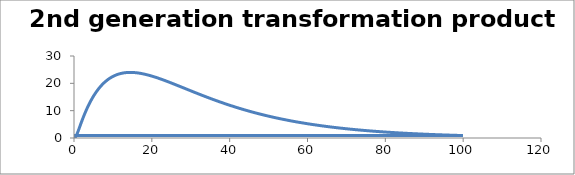
| Category | C - Sys 3 |
|---|---|
| 0.1 | 0 |
| 0.2 | 0.046 |
| 0.3 | 0.173 |
| 0.4 | 0.364 |
| 0.5 | 0.606 |
| 0.6 | 0.888 |
| 0.7000000000000001 | 1.201 |
| 0.8 | 1.538 |
| 0.9000000000000001 | 1.893 |
| 1.0 | 2.262 |
| 1.0999999999999999 | 2.642 |
| 1.2 | 3.028 |
| 1.3 | 3.418 |
| 1.4000000000000001 | 3.81 |
| 1.5 | 4.204 |
| 1.6 | 4.596 |
| 1.7000000000000002 | 4.987 |
| 1.8000000000000003 | 5.376 |
| 1.9 | 5.761 |
| 2.0 | 6.143 |
| 2.1 | 6.521 |
| 2.1999999999999997 | 6.894 |
| 2.3 | 7.262 |
| 2.4 | 7.626 |
| 2.5 | 7.984 |
| 2.6 | 8.337 |
| 2.7 | 8.686 |
| 2.8000000000000003 | 9.028 |
| 2.9000000000000004 | 9.366 |
| 3.0 | 9.698 |
| 3.1 | 10.025 |
| 3.2 | 10.347 |
| 3.3000000000000003 | 10.664 |
| 3.4000000000000004 | 10.975 |
| 3.5000000000000004 | 11.281 |
| 3.6000000000000005 | 11.582 |
| 3.6999999999999997 | 11.878 |
| 3.8 | 12.169 |
| 3.9 | 12.455 |
| 4.0 | 12.736 |
| 4.1000000000000005 | 13.012 |
| 4.2 | 13.284 |
| 4.300000000000001 | 13.55 |
| 4.3999999999999995 | 13.812 |
| 4.5 | 14.069 |
| 4.6 | 14.322 |
| 4.7 | 14.57 |
| 4.8 | 14.814 |
| 4.9 | 15.053 |
| 5.0 | 15.288 |
| 5.1000000000000005 | 15.518 |
| 5.2 | 15.744 |
| 5.3 | 15.966 |
| 5.4 | 16.184 |
| 5.5 | 16.398 |
| 5.6000000000000005 | 16.608 |
| 5.7 | 16.814 |
| 5.800000000000001 | 17.015 |
| 5.9 | 17.213 |
| 6.0 | 17.407 |
| 6.1 | 17.597 |
| 6.2 | 17.784 |
| 6.3 | 17.967 |
| 6.4 | 18.146 |
| 6.5 | 18.321 |
| 6.6000000000000005 | 18.493 |
| 6.7 | 18.662 |
| 6.800000000000001 | 18.827 |
| 6.9 | 18.988 |
| 7.000000000000001 | 19.146 |
| 7.1000000000000005 | 19.301 |
| 7.200000000000001 | 19.453 |
| 7.3 | 19.601 |
| 7.3999999999999995 | 19.746 |
| 7.5 | 19.888 |
| 7.6 | 20.027 |
| 7.7 | 20.162 |
| 7.8 | 20.295 |
| 7.9 | 20.425 |
| 8.0 | 20.551 |
| 8.1 | 20.675 |
| 8.200000000000001 | 20.796 |
| 8.3 | 20.914 |
| 8.4 | 21.029 |
| 8.5 | 21.142 |
| 8.600000000000001 | 21.251 |
| 8.700000000000001 | 21.358 |
| 8.799999999999999 | 21.463 |
| 8.9 | 21.565 |
| 9.0 | 21.664 |
| 9.1 | 21.76 |
| 9.2 | 21.854 |
| 9.3 | 21.946 |
| 9.4 | 22.035 |
| 9.5 | 22.122 |
| 9.6 | 22.206 |
| 9.700000000000001 | 22.288 |
| 9.8 | 22.367 |
| 9.9 | 22.445 |
| 10.0 | 22.52 |
| 10.100000000000001 | 22.593 |
| 10.200000000000001 | 22.663 |
| 10.3 | 22.732 |
| 10.4 | 22.798 |
| 10.5 | 22.862 |
| 10.6 | 22.924 |
| 10.7 | 22.984 |
| 10.8 | 23.042 |
| 10.9 | 23.098 |
| 11.0 | 23.152 |
| 11.1 | 23.205 |
| 11.200000000000001 | 23.255 |
| 11.3 | 23.303 |
| 11.4 | 23.349 |
| 11.5 | 23.394 |
| 11.600000000000001 | 23.437 |
| 11.700000000000001 | 23.478 |
| 11.8 | 23.517 |
| 11.9 | 23.555 |
| 12.0 | 23.591 |
| 12.1 | 23.625 |
| 12.2 | 23.657 |
| 12.3 | 23.688 |
| 12.4 | 23.717 |
| 12.5 | 23.745 |
| 12.6 | 23.771 |
| 12.7 | 23.795 |
| 12.8 | 23.818 |
| 12.9 | 23.84 |
| 13.0 | 23.86 |
| 13.100000000000001 | 23.879 |
| 13.200000000000001 | 23.896 |
| 13.3 | 23.911 |
| 13.4 | 23.926 |
| 13.5 | 23.939 |
| 13.600000000000001 | 23.95 |
| 13.700000000000001 | 23.961 |
| 13.8 | 23.969 |
| 13.900000000000002 | 23.977 |
| 14.000000000000002 | 23.983 |
| 14.100000000000001 | 23.989 |
| 14.200000000000001 | 23.993 |
| 14.3 | 23.995 |
| 14.400000000000002 | 23.997 |
| 14.499999999999998 | 23.997 |
| 14.6 | 23.996 |
| 14.7 | 23.994 |
| 14.799999999999999 | 23.991 |
| 14.899999999999999 | 23.987 |
| 15.0 | 23.981 |
| 15.1 | 23.975 |
| 15.2 | 23.967 |
| 15.299999999999999 | 23.959 |
| 15.4 | 23.949 |
| 15.5 | 23.939 |
| 15.6 | 23.927 |
| 15.7 | 23.915 |
| 15.8 | 23.901 |
| 15.9 | 23.887 |
| 16.0 | 23.871 |
| 16.1 | 23.855 |
| 16.2 | 23.838 |
| 16.3 | 23.82 |
| 16.400000000000002 | 23.801 |
| 16.5 | 23.781 |
| 16.6 | 23.76 |
| 16.7 | 23.739 |
| 16.8 | 23.717 |
| 16.900000000000002 | 23.694 |
| 17.0 | 23.67 |
| 17.1 | 23.645 |
| 17.200000000000003 | 23.62 |
| 17.3 | 23.593 |
| 17.400000000000002 | 23.566 |
| 17.5 | 23.539 |
| 17.599999999999998 | 23.51 |
| 17.7 | 23.481 |
| 17.8 | 23.451 |
| 17.9 | 23.421 |
| 18.0 | 23.39 |
| 18.099999999999998 | 23.358 |
| 18.2 | 23.326 |
| 18.3 | 23.293 |
| 18.4 | 23.259 |
| 18.5 | 23.225 |
| 18.6 | 23.19 |
| 18.7 | 23.154 |
| 18.8 | 23.118 |
| 18.9 | 23.082 |
| 19.0 | 23.045 |
| 19.1 | 23.007 |
| 19.2 | 22.969 |
| 19.3 | 22.93 |
| 19.400000000000002 | 22.891 |
| 19.5 | 22.851 |
| 19.6 | 22.811 |
| 19.7 | 22.77 |
| 19.8 | 22.729 |
| 19.900000000000002 | 22.687 |
| 20.0 | 22.645 |
| 20.1 | 22.602 |
| 20.200000000000003 | 22.559 |
| 20.3 | 22.516 |
| 20.400000000000002 | 22.472 |
| 20.5 | 22.427 |
| 20.6 | 22.383 |
| 20.700000000000003 | 22.338 |
| 20.8 | 22.292 |
| 20.9 | 22.246 |
| 21.0 | 22.2 |
| 21.099999999999998 | 22.153 |
| 21.2 | 22.106 |
| 21.3 | 22.059 |
| 21.4 | 22.011 |
| 21.5 | 21.963 |
| 21.6 | 21.915 |
| 21.7 | 21.866 |
| 21.8 | 21.817 |
| 21.9 | 21.768 |
| 22.0 | 21.718 |
| 22.1 | 21.668 |
| 22.2 | 21.618 |
| 22.3 | 21.568 |
| 22.400000000000002 | 21.517 |
| 22.5 | 21.466 |
| 22.6 | 21.415 |
| 22.7 | 21.363 |
| 22.8 | 21.312 |
| 22.900000000000002 | 21.26 |
| 23.0 | 21.208 |
| 23.1 | 21.155 |
| 23.200000000000003 | 21.103 |
| 23.3 | 21.05 |
| 23.400000000000002 | 20.997 |
| 23.5 | 20.943 |
| 23.6 | 20.89 |
| 23.700000000000003 | 20.836 |
| 23.8 | 20.782 |
| 23.900000000000002 | 20.728 |
| 24.0 | 20.674 |
| 24.099999999999998 | 20.62 |
| 24.2 | 20.565 |
| 24.3 | 20.51 |
| 24.4 | 20.456 |
| 24.5 | 20.401 |
| 24.6 | 20.345 |
| 24.7 | 20.29 |
| 24.8 | 20.235 |
| 24.9 | 20.179 |
| 25.0 | 20.123 |
| 25.1 | 20.068 |
| 25.2 | 20.012 |
| 25.3 | 19.956 |
| 25.4 | 19.899 |
| 25.5 | 19.843 |
| 25.6 | 19.787 |
| 25.7 | 19.73 |
| 25.8 | 19.674 |
| 25.900000000000002 | 19.617 |
| 26.0 | 19.561 |
| 26.1 | 19.504 |
| 26.200000000000003 | 19.447 |
| 26.3 | 19.39 |
| 26.400000000000002 | 19.333 |
| 26.5 | 19.276 |
| 26.6 | 19.219 |
| 26.700000000000003 | 19.162 |
| 26.8 | 19.104 |
| 26.900000000000002 | 19.047 |
| 27.0 | 18.99 |
| 27.1 | 18.932 |
| 27.200000000000003 | 18.875 |
| 27.3 | 18.818 |
| 27.400000000000002 | 18.76 |
| 27.500000000000004 | 18.703 |
| 27.6 | 18.645 |
| 27.700000000000003 | 18.587 |
| 27.800000000000004 | 18.53 |
| 27.900000000000002 | 18.472 |
| 28.000000000000004 | 18.415 |
| 28.1 | 18.357 |
| 28.200000000000003 | 18.299 |
| 28.300000000000004 | 18.242 |
| 28.400000000000002 | 18.184 |
| 28.500000000000004 | 18.127 |
| 28.6 | 18.069 |
| 28.700000000000003 | 18.011 |
| 28.800000000000004 | 17.954 |
| 28.9 | 17.896 |
| 28.999999999999996 | 17.839 |
| 29.099999999999998 | 17.781 |
| 29.2 | 17.724 |
| 29.299999999999997 | 17.666 |
| 29.4 | 17.609 |
| 29.5 | 17.551 |
| 29.599999999999998 | 17.494 |
| 29.7 | 17.436 |
| 29.799999999999997 | 17.379 |
| 29.9 | 17.322 |
| 30.0 | 17.264 |
| 30.099999999999998 | 17.207 |
| 30.2 | 17.15 |
| 30.3 | 17.093 |
| 30.4 | 17.036 |
| 30.5 | 16.979 |
| 30.599999999999998 | 16.922 |
| 30.7 | 16.865 |
| 30.8 | 16.808 |
| 30.9 | 16.751 |
| 31.0 | 16.694 |
| 31.1 | 16.637 |
| 31.2 | 16.581 |
| 31.3 | 16.524 |
| 31.4 | 16.468 |
| 31.5 | 16.411 |
| 31.6 | 16.355 |
| 31.7 | 16.298 |
| 31.8 | 16.242 |
| 31.900000000000002 | 16.186 |
| 32.0 | 16.13 |
| 32.1 | 16.074 |
| 32.2 | 16.018 |
| 32.300000000000004 | 15.962 |
| 32.4 | 15.906 |
| 32.5 | 15.851 |
| 32.6 | 15.795 |
| 32.7 | 15.739 |
| 32.800000000000004 | 15.684 |
| 32.9 | 15.629 |
| 33.0 | 15.573 |
| 33.1 | 15.518 |
| 33.2 | 15.463 |
| 33.300000000000004 | 15.408 |
| 33.4 | 15.353 |
| 33.5 | 15.298 |
| 33.6 | 15.244 |
| 33.7 | 15.189 |
| 33.800000000000004 | 15.135 |
| 33.900000000000006 | 15.08 |
| 34.0 | 15.026 |
| 34.1 | 14.972 |
| 34.2 | 14.918 |
| 34.300000000000004 | 14.864 |
| 34.400000000000006 | 14.81 |
| 34.5 | 14.756 |
| 34.6 | 14.702 |
| 34.7 | 14.649 |
| 34.800000000000004 | 14.595 |
| 34.900000000000006 | 14.542 |
| 35.0 | 14.489 |
| 35.1 | 14.436 |
| 35.199999999999996 | 14.383 |
| 35.3 | 14.33 |
| 35.4 | 14.277 |
| 35.5 | 14.225 |
| 35.6 | 14.172 |
| 35.699999999999996 | 14.12 |
| 35.8 | 14.067 |
| 35.9 | 14.015 |
| 36.0 | 13.963 |
| 36.1 | 13.911 |
| 36.199999999999996 | 13.859 |
| 36.3 | 13.808 |
| 36.4 | 13.756 |
| 36.5 | 13.705 |
| 36.6 | 13.653 |
| 36.7 | 13.602 |
| 36.8 | 13.551 |
| 36.9 | 13.5 |
| 37.0 | 13.449 |
| 37.1 | 13.399 |
| 37.2 | 13.348 |
| 37.3 | 13.298 |
| 37.4 | 13.247 |
| 37.5 | 13.197 |
| 37.6 | 13.147 |
| 37.7 | 13.097 |
| 37.8 | 13.047 |
| 37.9 | 12.998 |
| 38.0 | 12.948 |
| 38.1 | 12.899 |
| 38.2 | 12.85 |
| 38.3 | 12.8 |
| 38.4 | 12.751 |
| 38.5 | 12.702 |
| 38.6 | 12.654 |
| 38.7 | 12.605 |
| 38.800000000000004 | 12.557 |
| 38.9 | 12.508 |
| 39.0 | 12.46 |
| 39.1 | 12.412 |
| 39.2 | 12.364 |
| 39.300000000000004 | 12.316 |
| 39.4 | 12.269 |
| 39.5 | 12.221 |
| 39.6 | 12.174 |
| 39.7 | 12.126 |
| 39.800000000000004 | 12.079 |
| 39.900000000000006 | 12.032 |
| 40.0 | 11.985 |
| 40.1 | 11.939 |
| 40.2 | 11.892 |
| 40.300000000000004 | 11.846 |
| 40.400000000000006 | 11.799 |
| 40.5 | 11.753 |
| 40.6 | 11.707 |
| 40.7 | 11.661 |
| 40.800000000000004 | 11.616 |
| 40.900000000000006 | 11.57 |
| 41.0 | 11.524 |
| 41.1 | 11.479 |
| 41.2 | 11.434 |
| 41.300000000000004 | 11.389 |
| 41.400000000000006 | 11.344 |
| 41.5 | 11.299 |
| 41.6 | 11.254 |
| 41.699999999999996 | 11.21 |
| 41.8 | 11.165 |
| 41.9 | 11.121 |
| 42.0 | 11.077 |
| 42.1 | 11.033 |
| 42.199999999999996 | 10.989 |
| 42.3 | 10.946 |
| 42.4 | 10.902 |
| 42.5 | 10.859 |
| 42.6 | 10.815 |
| 42.699999999999996 | 10.772 |
| 42.8 | 10.729 |
| 42.9 | 10.686 |
| 43.0 | 10.644 |
| 43.1 | 10.601 |
| 43.2 | 10.559 |
| 43.3 | 10.516 |
| 43.4 | 10.474 |
| 43.5 | 10.432 |
| 43.6 | 10.39 |
| 43.7 | 10.349 |
| 43.8 | 10.307 |
| 43.9 | 10.265 |
| 44.0 | 10.224 |
| 44.1 | 10.183 |
| 44.2 | 10.142 |
| 44.3 | 10.101 |
| 44.4 | 10.06 |
| 44.5 | 10.019 |
| 44.6 | 9.979 |
| 44.7 | 9.939 |
| 44.800000000000004 | 9.898 |
| 44.9 | 9.858 |
| 45.0 | 9.818 |
| 45.1 | 9.778 |
| 45.2 | 9.739 |
| 45.300000000000004 | 9.699 |
| 45.4 | 9.66 |
| 45.5 | 9.62 |
| 45.6 | 9.581 |
| 45.7 | 9.542 |
| 45.800000000000004 | 9.503 |
| 45.9 | 9.465 |
| 46.0 | 9.426 |
| 46.1 | 9.387 |
| 46.2 | 9.349 |
| 46.300000000000004 | 9.311 |
| 46.400000000000006 | 9.273 |
| 46.5 | 9.235 |
| 46.6 | 9.197 |
| 46.7 | 9.159 |
| 46.800000000000004 | 9.122 |
| 46.900000000000006 | 9.084 |
| 47.0 | 9.047 |
| 47.1 | 9.01 |
| 47.2 | 8.973 |
| 47.300000000000004 | 8.936 |
| 47.400000000000006 | 8.899 |
| 47.5 | 8.863 |
| 47.6 | 8.826 |
| 47.7 | 8.79 |
| 47.800000000000004 | 8.754 |
| 47.900000000000006 | 8.717 |
| 48.0 | 8.681 |
| 48.1 | 8.646 |
| 48.199999999999996 | 8.61 |
| 48.3 | 8.574 |
| 48.4 | 8.539 |
| 48.5 | 8.504 |
| 48.6 | 8.468 |
| 48.699999999999996 | 8.433 |
| 48.8 | 8.398 |
| 48.9 | 8.364 |
| 49.0 | 8.329 |
| 49.1 | 8.294 |
| 49.2 | 8.26 |
| 49.3 | 8.226 |
| 49.4 | 8.191 |
| 49.5 | 8.157 |
| 49.6 | 8.123 |
| 49.7 | 8.09 |
| 49.8 | 8.056 |
| 49.9 | 8.022 |
| 50.0 | 7.989 |
| 50.1 | 7.956 |
| 50.2 | 7.922 |
| 50.3 | 7.889 |
| 50.4 | 7.856 |
| 50.5 | 7.824 |
| 50.6 | 7.791 |
| 50.7 | 7.758 |
| 50.8 | 7.726 |
| 50.9 | 7.694 |
| 51.0 | 7.661 |
| 51.1 | 7.629 |
| 51.2 | 7.597 |
| 51.300000000000004 | 7.566 |
| 51.4 | 7.534 |
| 51.5 | 7.502 |
| 51.6 | 7.471 |
| 51.7 | 7.44 |
| 51.800000000000004 | 7.408 |
| 51.9 | 7.377 |
| 52.0 | 7.346 |
| 52.1 | 7.315 |
| 52.2 | 7.285 |
| 52.300000000000004 | 7.254 |
| 52.400000000000006 | 7.223 |
| 52.5 | 7.193 |
| 52.6 | 7.163 |
| 52.7 | 7.133 |
| 52.800000000000004 | 7.102 |
| 52.900000000000006 | 7.073 |
| 53.0 | 7.043 |
| 53.1 | 7.013 |
| 53.2 | 6.983 |
| 53.300000000000004 | 6.954 |
| 53.400000000000006 | 6.925 |
| 53.5 | 6.895 |
| 53.6 | 6.866 |
| 53.7 | 6.837 |
| 53.800000000000004 | 6.808 |
| 53.900000000000006 | 6.779 |
| 54.0 | 6.751 |
| 54.1 | 6.722 |
| 54.2 | 6.694 |
| 54.300000000000004 | 6.665 |
| 54.400000000000006 | 6.637 |
| 54.50000000000001 | 6.609 |
| 54.6 | 6.581 |
| 54.7 | 6.553 |
| 54.800000000000004 | 6.525 |
| 54.900000000000006 | 6.498 |
| 55.00000000000001 | 6.47 |
| 55.1 | 6.443 |
| 55.2 | 6.415 |
| 55.300000000000004 | 6.388 |
| 55.400000000000006 | 6.361 |
| 55.50000000000001 | 6.334 |
| 55.60000000000001 | 6.307 |
| 55.7 | 6.28 |
| 55.800000000000004 | 6.253 |
| 55.900000000000006 | 6.227 |
| 56.00000000000001 | 6.2 |
| 56.10000000000001 | 6.174 |
| 56.2 | 6.147 |
| 56.300000000000004 | 6.121 |
| 56.400000000000006 | 6.095 |
| 56.50000000000001 | 6.069 |
| 56.60000000000001 | 6.043 |
| 56.7 | 6.017 |
| 56.800000000000004 | 5.992 |
| 56.900000000000006 | 5.966 |
| 57.00000000000001 | 5.941 |
| 57.10000000000001 | 5.915 |
| 57.2 | 5.89 |
| 57.300000000000004 | 5.865 |
| 57.400000000000006 | 5.84 |
| 57.50000000000001 | 5.815 |
| 57.60000000000001 | 5.79 |
| 57.699999999999996 | 5.765 |
| 57.8 | 5.741 |
| 57.9 | 5.716 |
| 57.99999999999999 | 5.692 |
| 58.099999999999994 | 5.667 |
| 58.199999999999996 | 5.643 |
| 58.3 | 5.619 |
| 58.4 | 5.595 |
| 58.5 | 5.571 |
| 58.599999999999994 | 5.547 |
| 58.699999999999996 | 5.523 |
| 58.8 | 5.499 |
| 58.9 | 5.476 |
| 59.0 | 5.452 |
| 59.099999999999994 | 5.429 |
| 59.199999999999996 | 5.406 |
| 59.3 | 5.382 |
| 59.4 | 5.359 |
| 59.5 | 5.336 |
| 59.599999999999994 | 5.313 |
| 59.699999999999996 | 5.29 |
| 59.8 | 5.268 |
| 59.9 | 5.245 |
| 60.0 | 5.222 |
| 60.099999999999994 | 5.2 |
| 60.199999999999996 | 5.178 |
| 60.3 | 5.155 |
| 60.4 | 5.133 |
| 60.5 | 5.111 |
| 60.6 | 5.089 |
| 60.699999999999996 | 5.067 |
| 60.8 | 5.045 |
| 60.9 | 5.024 |
| 61.0 | 5.002 |
| 61.1 | 4.98 |
| 61.199999999999996 | 4.959 |
| 61.3 | 4.937 |
| 61.4 | 4.916 |
| 61.5 | 4.895 |
| 61.6 | 4.874 |
| 61.7 | 4.853 |
| 61.8 | 4.832 |
| 61.9 | 4.811 |
| 62.0 | 4.79 |
| 62.1 | 4.77 |
| 62.2 | 4.749 |
| 62.3 | 4.728 |
| 62.4 | 4.708 |
| 62.5 | 4.688 |
| 62.6 | 4.667 |
| 62.7 | 4.647 |
| 62.8 | 4.627 |
| 62.9 | 4.607 |
| 63.0 | 4.587 |
| 63.1 | 4.567 |
| 63.2 | 4.548 |
| 63.3 | 4.528 |
| 63.4 | 4.508 |
| 63.5 | 4.489 |
| 63.6 | 4.469 |
| 63.7 | 4.45 |
| 63.800000000000004 | 4.431 |
| 63.9 | 4.412 |
| 64.0 | 4.392 |
| 64.1 | 4.373 |
| 64.2 | 4.354 |
| 64.3 | 4.336 |
| 64.4 | 4.317 |
| 64.5 | 4.298 |
| 64.60000000000001 | 4.279 |
| 64.7 | 4.261 |
| 64.8 | 4.242 |
| 64.9 | 4.224 |
| 65.0 | 4.206 |
| 65.10000000000001 | 4.187 |
| 65.2 | 4.169 |
| 65.3 | 4.151 |
| 65.4 | 4.133 |
| 65.5 | 4.115 |
| 65.60000000000001 | 4.097 |
| 65.7 | 4.079 |
| 65.8 | 4.062 |
| 65.9 | 4.044 |
| 66.0 | 4.026 |
| 66.10000000000001 | 4.009 |
| 66.2 | 3.991 |
| 66.3 | 3.974 |
| 66.4 | 3.957 |
| 66.5 | 3.94 |
| 66.60000000000001 | 3.922 |
| 66.7 | 3.905 |
| 66.8 | 3.888 |
| 66.9 | 3.872 |
| 67.0 | 3.855 |
| 67.10000000000001 | 3.838 |
| 67.2 | 3.821 |
| 67.30000000000001 | 3.805 |
| 67.4 | 3.788 |
| 67.5 | 3.771 |
| 67.60000000000001 | 3.755 |
| 67.7 | 3.739 |
| 67.80000000000001 | 3.722 |
| 67.9 | 3.706 |
| 68.0 | 3.69 |
| 68.10000000000001 | 3.674 |
| 68.2 | 3.658 |
| 68.30000000000001 | 3.642 |
| 68.4 | 3.626 |
| 68.5 | 3.61 |
| 68.60000000000001 | 3.595 |
| 68.7 | 3.579 |
| 68.80000000000001 | 3.563 |
| 68.9 | 3.548 |
| 69.0 | 3.532 |
| 69.10000000000001 | 3.517 |
| 69.2 | 3.501 |
| 69.30000000000001 | 3.486 |
| 69.4 | 3.471 |
| 69.5 | 3.456 |
| 69.60000000000001 | 3.441 |
| 69.7 | 3.426 |
| 69.80000000000001 | 3.411 |
| 69.9 | 3.396 |
| 70.0 | 3.381 |
| 70.10000000000001 | 3.366 |
| 70.2 | 3.352 |
| 70.30000000000001 | 3.337 |
| 70.39999999999999 | 3.322 |
| 70.5 | 3.308 |
| 70.6 | 3.293 |
| 70.7 | 3.279 |
| 70.8 | 3.265 |
| 70.89999999999999 | 3.25 |
| 71.0 | 3.236 |
| 71.1 | 3.222 |
| 71.2 | 3.208 |
| 71.3 | 3.194 |
| 71.39999999999999 | 3.18 |
| 71.5 | 3.166 |
| 71.6 | 3.152 |
| 71.7 | 3.138 |
| 71.8 | 3.125 |
| 71.89999999999999 | 3.111 |
| 72.0 | 3.097 |
| 72.1 | 3.084 |
| 72.2 | 3.07 |
| 72.3 | 3.057 |
| 72.39999999999999 | 3.043 |
| 72.5 | 3.03 |
| 72.6 | 3.017 |
| 72.7 | 3.004 |
| 72.8 | 2.99 |
| 72.89999999999999 | 2.977 |
| 73.0 | 2.964 |
| 73.1 | 2.951 |
| 73.2 | 2.938 |
| 73.3 | 2.925 |
| 73.4 | 2.913 |
| 73.5 | 2.9 |
| 73.6 | 2.887 |
| 73.7 | 2.874 |
| 73.8 | 2.862 |
| 73.9 | 2.849 |
| 74.0 | 2.837 |
| 74.1 | 2.824 |
| 74.2 | 2.812 |
| 74.3 | 2.8 |
| 74.4 | 2.787 |
| 74.5 | 2.775 |
| 74.6 | 2.763 |
| 74.7 | 2.751 |
| 74.8 | 2.739 |
| 74.9 | 2.727 |
| 75.0 | 2.715 |
| 75.1 | 2.703 |
| 75.2 | 2.691 |
| 75.3 | 2.679 |
| 75.4 | 2.667 |
| 75.5 | 2.656 |
| 75.6 | 2.644 |
| 75.7 | 2.632 |
| 75.8 | 2.621 |
| 75.9 | 2.609 |
| 76.0 | 2.598 |
| 76.1 | 2.587 |
| 76.2 | 2.575 |
| 76.3 | 2.564 |
| 76.4 | 2.553 |
| 76.5 | 2.541 |
| 76.6 | 2.53 |
| 76.7 | 2.519 |
| 76.8 | 2.508 |
| 76.9 | 2.497 |
| 77.0 | 2.486 |
| 77.10000000000001 | 2.475 |
| 77.2 | 2.464 |
| 77.3 | 2.453 |
| 77.4 | 2.443 |
| 77.5 | 2.432 |
| 77.60000000000001 | 2.421 |
| 77.7 | 2.411 |
| 77.8 | 2.4 |
| 77.9 | 2.389 |
| 78.0 | 2.379 |
| 78.10000000000001 | 2.368 |
| 78.2 | 2.358 |
| 78.3 | 2.348 |
| 78.4 | 2.337 |
| 78.5 | 2.327 |
| 78.60000000000001 | 2.317 |
| 78.7 | 2.307 |
| 78.8 | 2.296 |
| 78.9 | 2.286 |
| 79.0 | 2.276 |
| 79.10000000000001 | 2.266 |
| 79.2 | 2.256 |
| 79.3 | 2.246 |
| 79.4 | 2.236 |
| 79.5 | 2.227 |
| 79.60000000000001 | 2.217 |
| 79.7 | 2.207 |
| 79.80000000000001 | 2.197 |
| 79.9 | 2.188 |
| 80.0 | 2.178 |
| 80.10000000000001 | 2.168 |
| 80.2 | 2.159 |
| 80.30000000000001 | 2.149 |
| 80.4 | 2.14 |
| 80.5 | 2.131 |
| 80.60000000000001 | 2.121 |
| 80.7 | 2.112 |
| 80.80000000000001 | 2.102 |
| 80.9 | 2.093 |
| 81.0 | 2.084 |
| 81.10000000000001 | 2.075 |
| 81.2 | 2.066 |
| 81.30000000000001 | 2.057 |
| 81.4 | 2.048 |
| 81.5 | 2.039 |
| 81.60000000000001 | 2.03 |
| 81.7 | 2.021 |
| 81.80000000000001 | 2.012 |
| 81.9 | 2.003 |
| 82.0 | 1.994 |
| 82.10000000000001 | 1.985 |
| 82.2 | 1.976 |
| 82.30000000000001 | 1.968 |
| 82.4 | 1.959 |
| 82.5 | 1.95 |
| 82.60000000000001 | 1.942 |
| 82.7 | 1.933 |
| 82.80000000000001 | 1.925 |
| 82.9 | 1.916 |
| 83.0 | 1.908 |
| 83.10000000000001 | 1.899 |
| 83.2 | 1.891 |
| 83.3 | 1.883 |
| 83.39999999999999 | 1.874 |
| 83.5 | 1.866 |
| 83.6 | 1.858 |
| 83.7 | 1.85 |
| 83.8 | 1.842 |
| 83.89999999999999 | 1.833 |
| 84.0 | 1.825 |
| 84.1 | 1.817 |
| 84.2 | 1.809 |
| 84.3 | 1.801 |
| 84.39999999999999 | 1.793 |
| 84.5 | 1.785 |
| 84.6 | 1.778 |
| 84.7 | 1.77 |
| 84.8 | 1.762 |
| 84.89999999999999 | 1.754 |
| 85.0 | 1.746 |
| 85.1 | 1.739 |
| 85.2 | 1.731 |
| 85.3 | 1.723 |
| 85.39999999999999 | 1.716 |
| 85.5 | 1.708 |
| 85.6 | 1.701 |
| 85.7 | 1.693 |
| 85.8 | 1.686 |
| 85.9 | 1.678 |
| 86.0 | 1.671 |
| 86.1 | 1.663 |
| 86.2 | 1.656 |
| 86.3 | 1.649 |
| 86.4 | 1.641 |
| 86.5 | 1.634 |
| 86.6 | 1.627 |
| 86.7 | 1.62 |
| 86.8 | 1.613 |
| 86.9 | 1.606 |
| 87.0 | 1.598 |
| 87.1 | 1.591 |
| 87.2 | 1.584 |
| 87.3 | 1.577 |
| 87.4 | 1.57 |
| 87.5 | 1.563 |
| 87.6 | 1.557 |
| 87.7 | 1.55 |
| 87.8 | 1.543 |
| 87.9 | 1.536 |
| 88.0 | 1.529 |
| 88.1 | 1.522 |
| 88.2 | 1.516 |
| 88.3 | 1.509 |
| 88.4 | 1.502 |
| 88.5 | 1.496 |
| 88.6 | 1.489 |
| 88.7 | 1.483 |
| 88.8 | 1.476 |
| 88.9 | 1.47 |
| 89.0 | 1.463 |
| 89.1 | 1.457 |
| 89.2 | 1.45 |
| 89.3 | 1.444 |
| 89.4 | 1.437 |
| 89.5 | 1.431 |
| 89.60000000000001 | 1.425 |
| 89.7 | 1.418 |
| 89.8 | 1.412 |
| 89.9 | 1.406 |
| 90.0 | 1.4 |
| 90.10000000000001 | 1.393 |
| 90.2 | 1.387 |
| 90.3 | 1.381 |
| 90.4 | 1.375 |
| 90.5 | 1.369 |
| 90.60000000000001 | 1.363 |
| 90.7 | 1.357 |
| 90.8 | 1.351 |
| 90.9 | 1.345 |
| 91.0 | 1.339 |
| 91.10000000000001 | 1.333 |
| 91.2 | 1.327 |
| 91.3 | 1.321 |
| 91.4 | 1.315 |
| 91.5 | 1.31 |
| 91.60000000000001 | 1.304 |
| 91.7 | 1.298 |
| 91.8 | 1.292 |
| 91.9 | 1.287 |
| 92.0 | 1.281 |
| 92.10000000000001 | 1.275 |
| 92.2 | 1.27 |
| 92.30000000000001 | 1.264 |
| 92.4 | 1.258 |
| 92.5 | 1.253 |
| 92.60000000000001 | 1.247 |
| 92.7 | 1.242 |
| 92.80000000000001 | 1.236 |
| 92.9 | 1.231 |
| 93.0 | 1.225 |
| 93.10000000000001 | 1.22 |
| 93.2 | 1.215 |
| 93.30000000000001 | 1.209 |
| 93.4 | 1.204 |
| 93.5 | 1.199 |
| 93.60000000000001 | 1.193 |
| 93.7 | 1.188 |
| 93.80000000000001 | 1.183 |
| 93.9 | 1.177 |
| 94.0 | 1.172 |
| 94.10000000000001 | 1.167 |
| 94.2 | 1.162 |
| 94.30000000000001 | 1.157 |
| 94.4 | 1.152 |
| 94.5 | 1.147 |
| 94.60000000000001 | 1.141 |
| 94.7 | 1.136 |
| 94.80000000000001 | 1.131 |
| 94.9 | 1.126 |
| 95.0 | 1.121 |
| 95.10000000000001 | 1.116 |
| 95.2 | 1.112 |
| 95.30000000000001 | 1.107 |
| 95.4 | 1.102 |
| 95.5 | 1.097 |
| 95.60000000000001 | 1.092 |
| 95.7 | 1.087 |
| 95.80000000000001 | 1.082 |
| 95.9 | 1.078 |
| 96.0 | 1.073 |
| 96.1 | 1.068 |
| 96.2 | 1.063 |
| 96.3 | 1.059 |
| 96.39999999999999 | 1.054 |
| 96.5 | 1.049 |
| 96.6 | 1.045 |
| 96.7 | 1.04 |
| 96.8 | 1.035 |
| 96.89999999999999 | 1.031 |
| 97.0 | 1.026 |
| 97.1 | 1.022 |
| 97.2 | 1.017 |
| 97.3 | 1.013 |
| 97.39999999999999 | 1.008 |
| 97.5 | 1.004 |
| 97.6 | 0.999 |
| 97.7 | 0.995 |
| 97.8 | 0.99 |
| 97.89999999999999 | 0.986 |
| 98.0 | 0.982 |
| 98.1 | 0.977 |
| 98.2 | 0.973 |
| 98.3 | 0.969 |
| 98.4 | 0.964 |
| 98.5 | 0.96 |
| 98.6 | 0.956 |
| 98.7 | 0.952 |
| 98.8 | 0.947 |
| 98.9 | 0.943 |
| 99.0 | 0.939 |
| 99.1 | 0.935 |
| 99.2 | 0.931 |
| 99.3 | 0.927 |
| 99.4 | 0.923 |
| 99.5 | 0.918 |
| 99.6 | 0.914 |
| 99.7 | 0.91 |
| 99.8 | 0.906 |
| 99.9 | 0.902 |
| 100.0 | 0.898 |